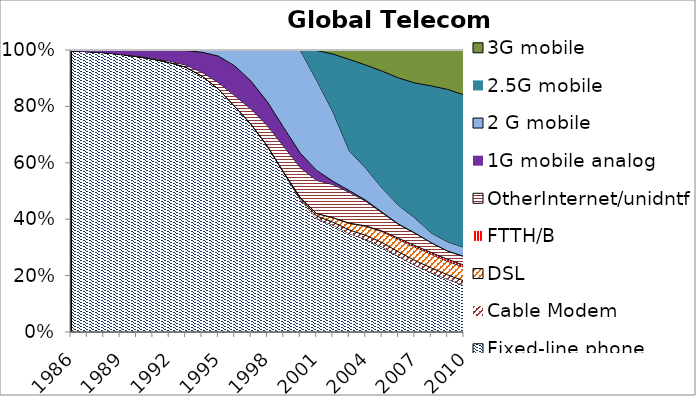
| Category | Fixed-line phone | Cable Modem | DSL | FTTH/B | OtherInternet/unidntf. | 1G mobile analog  | 2 G mobile | 2.5G mobile | 3G mobile |
|---|---|---|---|---|---|---|---|---|---|
| 1986.0 | 422425529.323 | 0 | 0 | 0 | 16000 | 1472155.811 | 0 | 0 | 0 |
| 1987.0 | 443247800.539 | 0 | 0 | 0 | 30000 | 2573508.767 | 0 | 0 | 0 |
| 1988.0 | 466885751.305 | 0 | 0 | 0 | 108996.828 | 4353694.556 | 0 | 0 | 0 |
| 1989.0 | 491805804.385 | 0 | 0 | 0 | 246498.491 | 7385111.944 | 0 | 0 | 0 |
| 1990.0 | 519030199 | 0 | 0 | 0 | 1145418 | 11211543 | 0 | 0 | 0 |
| 1991.0 | 544126950 | 0 | 0 | 0 | 1988498 | 16286524 | 0 | 0 | 0 |
| 1992.0 | 571166406 | 0 | 0 | 0 | 3169189 | 23064745 | 200000 | 0 | 0 |
| 1993.0 | 602020985 | 0 | 0 | 0 | 4718949 | 32792136 | 1400000 | 0 | 0 |
| 1994.0 | 638155927 | 0 | 0 | 0 | 9507140 | 49953365 | 5600000 | 0 | 0 |
| 1995.0 | 677857824 | 0 | 0 | 0 | 18033971 | 73784176 | 17020000 | 0 | 0 |
| 1996.0 | 716126226 | 0 | 26000 | 0 | 34125490 | 94569386 | 50550000 | 0 | 0 |
| 1997.0 | 754700907 | 705829 | 175264 | 0 | 54801269 | 101623352 | 113420000 | 0 | 0 |
| 1998.0 | 778132806 | 1448133 | 382094 | 0 | 85490674 | 99662183 | 218600000 | 0 | 0 |
| 1999.0 | 808058955 | 2661414 | 779703 | 0 | 131266203 | 95555835 | 396400000 | 0 | 0 |
| 2000.0 | 830942114 | 7883544 | 6184042 | 0 | 188336377 | 90392064 | 648365457 | 0 | 0 |
| 2001.0 | 839525064 | 15385711 | 18379022 | 131000 | 244033280 | 74333169 | 664269050 | 219770477 | 3677200 |
| 2002.0 | 868514662 | 24229811 | 36129420 | 802189 | 269216525 | 26000000 | 563837895 | 470939798 | 33274200 |
| 2003.0 | 914480134 | 33792798 | 61531085 | 2109900 | 286650043 | 15700000 | 369852276 | 849627060 | 88110000 |
| 2004.0 | 1010800626 | 43278615 | 98468510 | 4882971 | 268560621 | 10700000 | 350718504 | 1123906769 | 164028000 |
| 2005.0 | 1092360063 | 54631852 | 139725113 | 9308877 | 232372048 | 7600000 | 309272612 | 1500561025 | 271587126 |
| 2006.0 | 1126965726 | 68603264 | 184408011 | 17858357 | 206285154 | 5169874 | 278255888 | 1900717163 | 416822098 |
| 2007.0 | 1144317733 | 81458450 | 231336827 | 25384522 | 212707347 | 2739747 | 260020905 | 2314094393 | 565441708 |
| 2008.0 | 1166700599 | 90522230 | 266222311 | 33947552 | 193106647 | 309621 | 191118910 | 2883172252 | 702966271 |
| 2009.0 | 1162855675 | 97757480 | 298362745 | 44480825 | 180643031 | 9593 | 203545343 | 3361076985 | 869503107 |
| 2010.0 | 1150526723 | 106073778 | 332228547 | 55335252 | 214089556 | 0 | 225415398 | 3751310830 | 1104640485 |